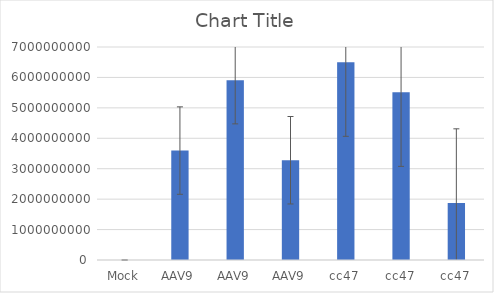
| Category | Series 0 |
|---|---|
| Mock | 363.271 |
| AAV9 | 3595822582.493 |
| AAV9 | 5911152327.16 |
| AAV9 | 3278712342.049 |
| cc47 | 6500827752.716 |
| cc47 | 5513267295.271 |
| cc47 | 1875142599.993 |